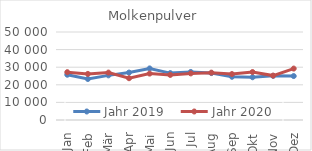
| Category | Jahr 2019 | Jahr 2020 |
|---|---|---|
| Jan | 25728.274 | 27170.549 |
| Feb | 23302.15 | 26184.964 |
| Mär | 25360.739 | 26944.238 |
| Apr | 26958.124 | 23738.003 |
| Mai | 29309.46 | 26368.034 |
| Jun | 26646.149 | 25610.975 |
| Jul | 27302.548 | 26472.072 |
| Aug | 26662.757 | 26915.347 |
| Sep | 24559.42 | 26104.728 |
| Okt | 24285.837 | 27246.155 |
| Nov | 25081.925 | 25227.655 |
| Dez | 24968.707 | 29217.161 |